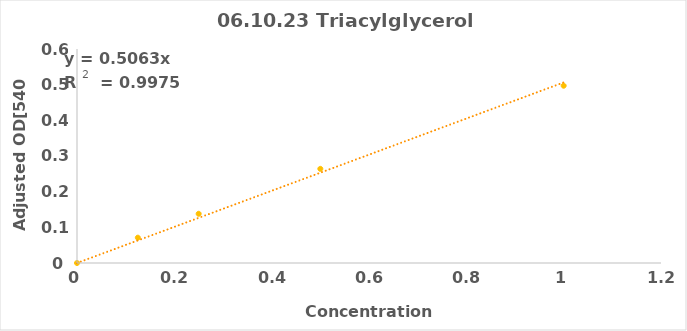
| Category | Series 0 |
|---|---|
| 0.0 | 0 |
| 0.125 | 0.071 |
| 0.25 | 0.138 |
| 0.5 | 0.264 |
| 1.0 | 0.497 |